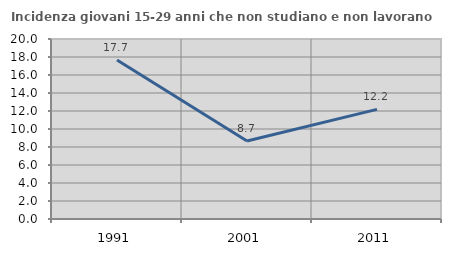
| Category | Incidenza giovani 15-29 anni che non studiano e non lavorano  |
|---|---|
| 1991.0 | 17.676 |
| 2001.0 | 8.675 |
| 2011.0 | 12.177 |